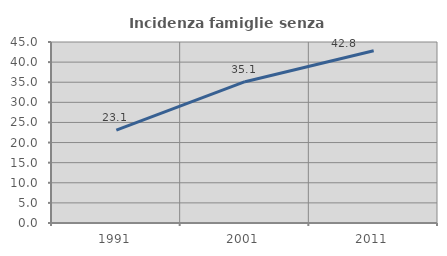
| Category | Incidenza famiglie senza nuclei |
|---|---|
| 1991.0 | 23.114 |
| 2001.0 | 35.133 |
| 2011.0 | 42.823 |